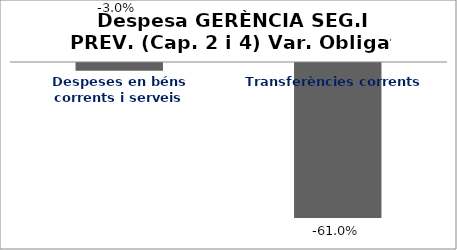
| Category | Series 0 |
|---|---|
| Despeses en béns corrents i serveis | -0.03 |
| Transferències corrents | -0.61 |